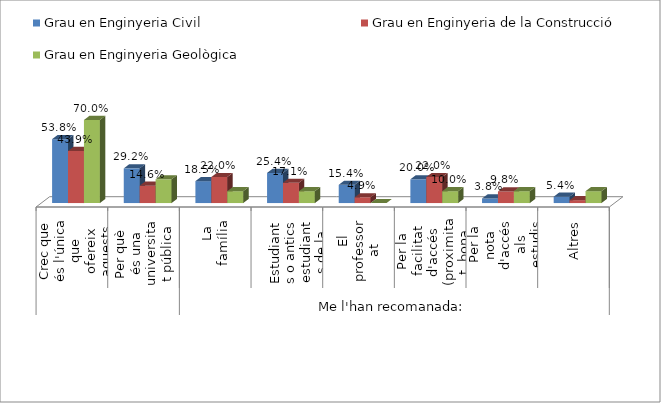
| Category | Grau en Enginyeria Civil | Grau en Enginyeria de la Construcció | Grau en Enginyeria Geològica |
|---|---|---|---|
| 0 | 0.538 | 0.439 | 0.7 |
| 1 | 0.292 | 0.146 | 0.2 |
| 2 | 0.185 | 0.22 | 0.1 |
| 3 | 0.254 | 0.171 | 0.1 |
| 4 | 0.154 | 0.049 | 0 |
| 5 | 0.2 | 0.22 | 0.1 |
| 6 | 0.038 | 0.098 | 0.1 |
| 7 | 0.054 | 0.024 | 0.1 |